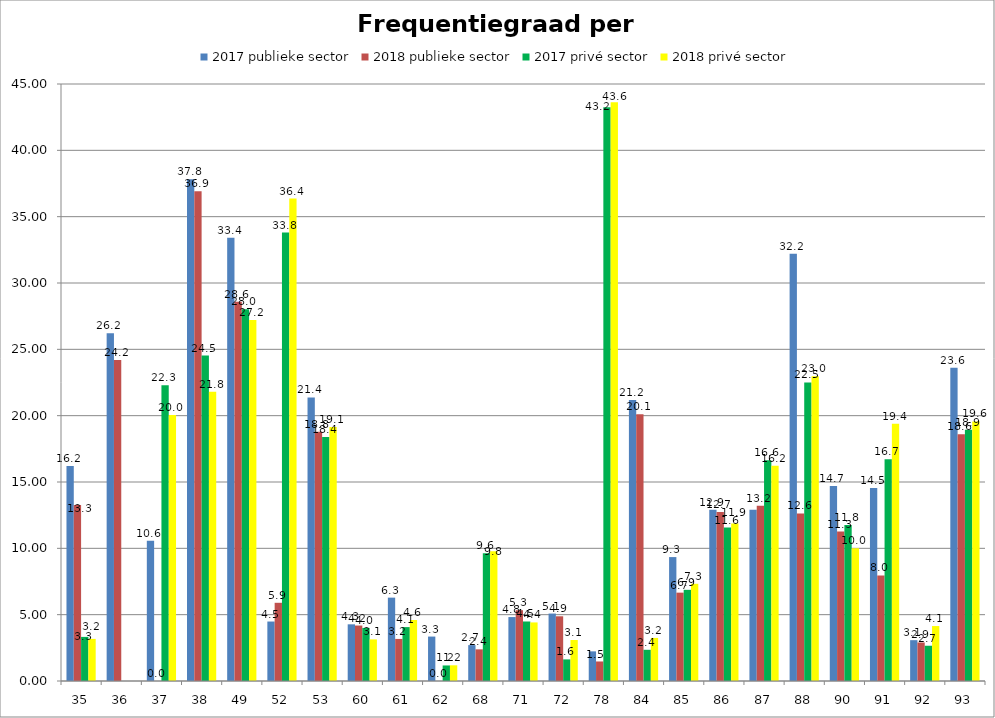
| Category | 2017 publieke sector | 2018 publieke sector | 2017 privé sector | 2018 privé sector |
|---|---|---|---|---|
| 35 | 16.197 | 13.265 | 3.324 | 3.174 |
| 36 | 26.203 | 24.203 | 0 | 0 |
| 37 | 10.573 | 0 | 22.29 | 20.05 |
| 38 | 37.816 | 36.924 | 24.535 | 21.796 |
| 49 | 33.407 | 28.596 | 28.027 | 27.205 |
| 52 | 4.483 | 5.895 | 33.804 | 36.364 |
| 53 | 21.375 | 18.781 | 18.392 | 19.148 |
| 60 | 4.272 | 4.18 | 3.999 | 3.135 |
| 61 | 6.284 | 3.172 | 4.063 | 4.597 |
| 62 | 3.349 | 0 | 1.172 | 1.184 |
| 68 | 2.705 | 2.386 | 9.635 | 9.787 |
| 71 | 4.819 | 5.337 | 4.485 | 4.415 |
| 72 | 5.083 | 4.878 | 1.628 | 3.089 |
| 78 | 2.235 | 1.472 | 43.248 | 43.627 |
| 84 | 21.172 | 20.1 | 2.353 | 3.247 |
| 85 | 9.341 | 6.659 | 6.872 | 7.327 |
| 86 | 12.899 | 12.737 | 11.565 | 11.867 |
| 87 | 12.909 | 13.213 | 16.646 | 16.216 |
| 88 | 32.199 | 12.628 | 22.505 | 22.975 |
| 90 | 14.691 | 11.266 | 11.758 | 10.008 |
| 91 | 14.549 | 7.952 | 16.713 | 19.395 |
| 92 | 3.078 | 2.904 | 2.657 | 4.142 |
| 93 | 23.603 | 18.6 | 18.936 | 19.562 |